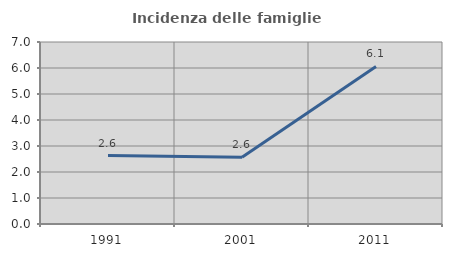
| Category | Incidenza delle famiglie numerose |
|---|---|
| 1991.0 | 2.632 |
| 2001.0 | 2.564 |
| 2011.0 | 6.061 |